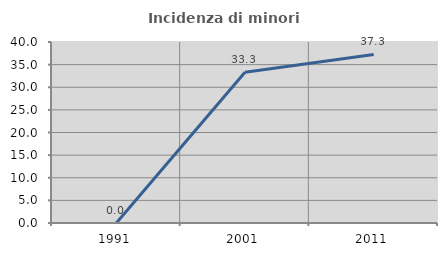
| Category | Incidenza di minori stranieri |
|---|---|
| 1991.0 | 0 |
| 2001.0 | 33.333 |
| 2011.0 | 37.255 |